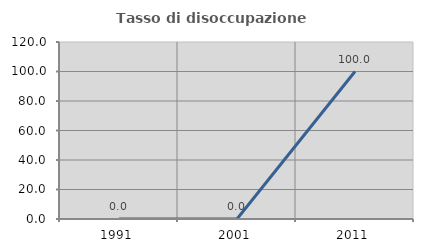
| Category | Tasso di disoccupazione giovanile  |
|---|---|
| 1991.0 | 0 |
| 2001.0 | 0 |
| 2011.0 | 100 |